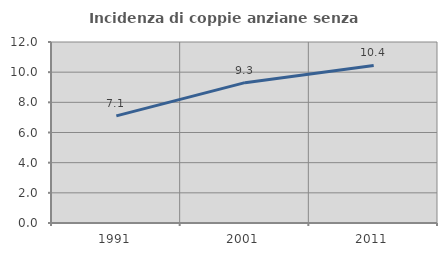
| Category | Incidenza di coppie anziane senza figli  |
|---|---|
| 1991.0 | 7.102 |
| 2001.0 | 9.305 |
| 2011.0 | 10.449 |